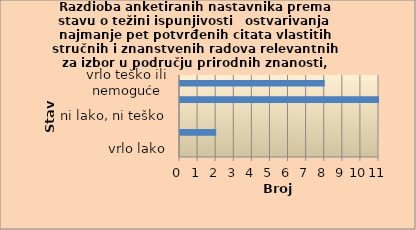
| Category | Series 0 |
|---|---|
| vrlo lako | 0 |
| lako | 2 |
| ni lako, ni teško | 0 |
| teško | 11 |
| vrlo teško ili nemoguće | 8 |